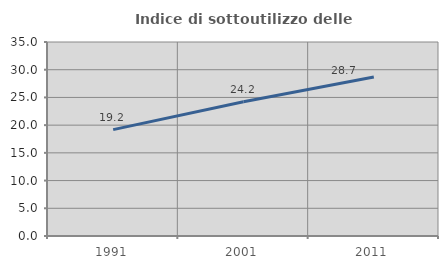
| Category | Indice di sottoutilizzo delle abitazioni  |
|---|---|
| 1991.0 | 19.188 |
| 2001.0 | 24.216 |
| 2011.0 | 28.674 |